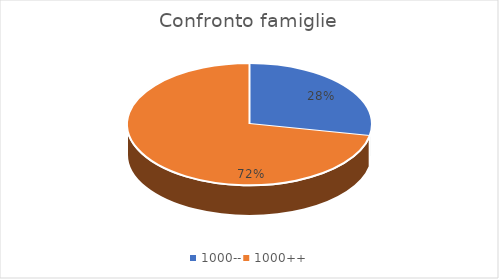
| Category | Series 0 |
|---|---|
| 1000-- | 127 |
| 1000++ | 325 |